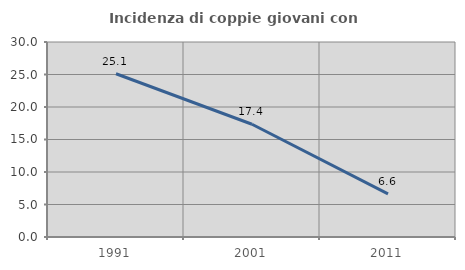
| Category | Incidenza di coppie giovani con figli |
|---|---|
| 1991.0 | 25.113 |
| 2001.0 | 17.351 |
| 2011.0 | 6.641 |